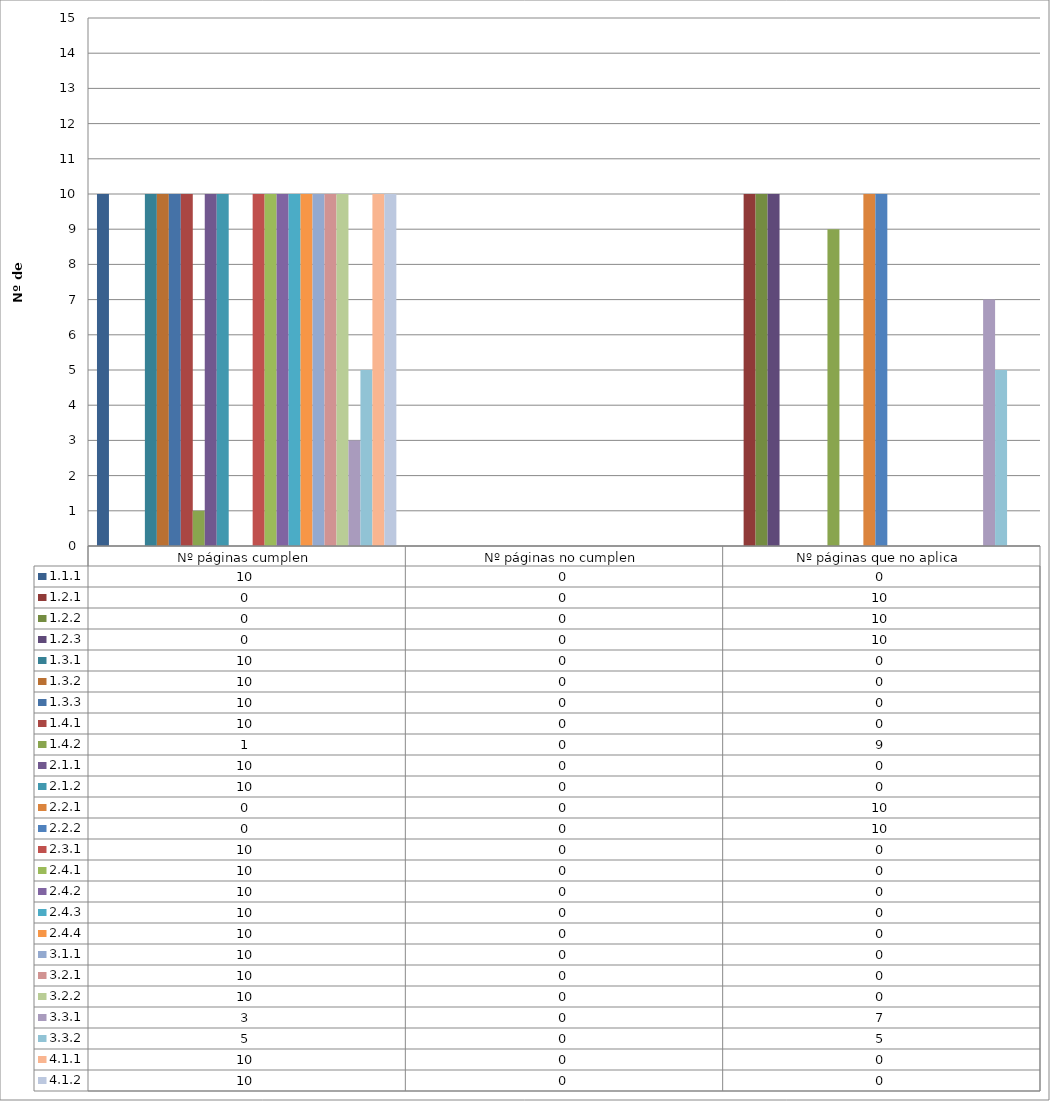
| Category | 1.1.1  | 1.2.1 | 1.2.2  | 1.2.3 | 1.3.1 | 1.3.2 | 1.3.3 | 1.4.1 | 1.4.2 | 2.1.1 | 2.1.2 | 2.2.1  | 2.2.2 | 2.3.1 | 2.4.1 | 2.4.2 | 2.4.3 | 2.4.4 | 3.1.1  | 3.2.1 | 3.2.2 | 3.3.1 | 3.3.2 | 4.1.1 | 4.1.2 |
|---|---|---|---|---|---|---|---|---|---|---|---|---|---|---|---|---|---|---|---|---|---|---|---|---|---|
| 0 | 10 | 0 | 0 | 0 | 10 | 10 | 10 | 10 | 1 | 10 | 10 | 0 | 0 | 10 | 10 | 10 | 10 | 10 | 10 | 10 | 10 | 3 | 5 | 10 | 10 |
| 1 | 0 | 0 | 0 | 0 | 0 | 0 | 0 | 0 | 0 | 0 | 0 | 0 | 0 | 0 | 0 | 0 | 0 | 0 | 0 | 0 | 0 | 0 | 0 | 0 | 0 |
| 2 | 0 | 10 | 10 | 10 | 0 | 0 | 0 | 0 | 9 | 0 | 0 | 10 | 10 | 0 | 0 | 0 | 0 | 0 | 0 | 0 | 0 | 7 | 5 | 0 | 0 |